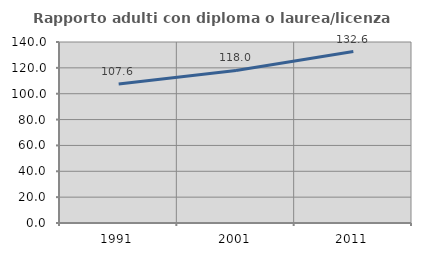
| Category | Rapporto adulti con diploma o laurea/licenza media  |
|---|---|
| 1991.0 | 107.563 |
| 2001.0 | 117.966 |
| 2011.0 | 132.635 |